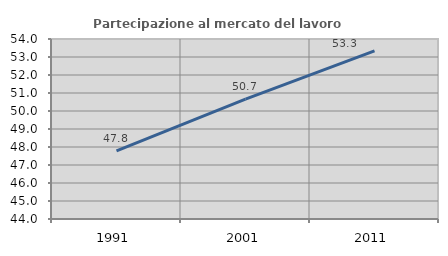
| Category | Partecipazione al mercato del lavoro  femminile |
|---|---|
| 1991.0 | 47.781 |
| 2001.0 | 50.656 |
| 2011.0 | 53.337 |